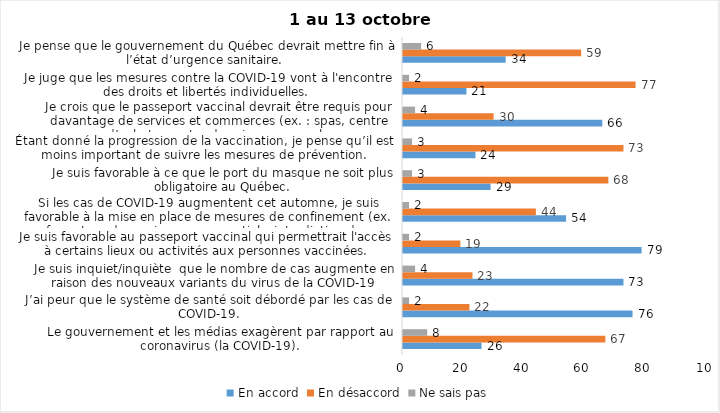
| Category | En accord | En désaccord | Ne sais pas |
|---|---|---|---|
| Le gouvernement et les médias exagèrent par rapport au coronavirus (la COVID-19). | 26 | 67 | 8 |
| J’ai peur que le système de santé soit débordé par les cas de COVID-19. | 76 | 22 | 2 |
| Je suis inquiet/inquiète  que le nombre de cas augmente en raison des nouveaux variants du virus de la COVID-19 | 73 | 23 | 4 |
| Je suis favorable au passeport vaccinal qui permettrait l'accès à certains lieux ou activités aux personnes vaccinées. | 79 | 19 | 2 |
| Si les cas de COVID-19 augmentent cet automne, je suis favorable à la mise en place de mesures de confinement (ex. fermeture de services non essentiels, interdiction des rassemblements privés) | 54 | 44 | 2 |
| Je suis favorable à ce que le port du masque ne soit plus obligatoire au Québec. | 29 | 68 | 3 |
| Étant donné la progression de la vaccination, je pense qu’il est moins important de suivre les mesures de prévention. | 24 | 73 | 3 |
| Je crois que le passeport vaccinal devrait être requis pour davantage de services et commerces (ex. : spas, centre d’achats, centre de soins personnels. | 66 | 30 | 4 |
| Je juge que les mesures contre la COVID-19 vont à l'encontre des droits et libertés individuelles.  | 21 | 77 | 2 |
| Je pense que le gouvernement du Québec devrait mettre fin à l’état d’urgence sanitaire.  | 34 | 59 | 6 |